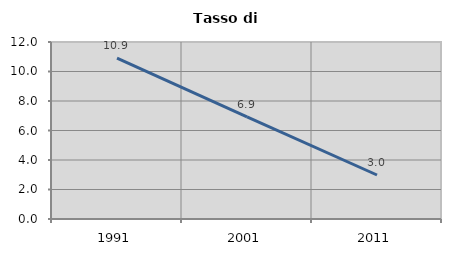
| Category | Tasso di disoccupazione   |
|---|---|
| 1991.0 | 10.909 |
| 2001.0 | 6.917 |
| 2011.0 | 2.983 |